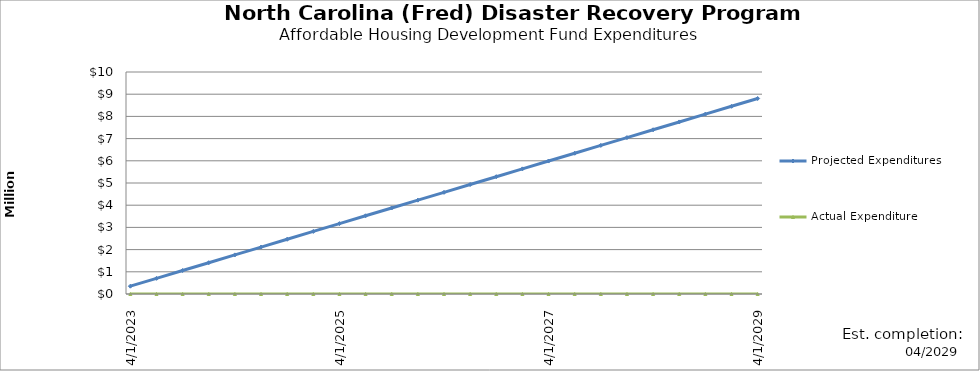
| Category | Projected Expenditures | Actual Expenditure |
|---|---|---|
| 4/1/23 | 352268 | 0 |
| 7/1/23 | 704536 | 0 |
| 10/1/23 | 1056804 | 0 |
| 1/1/24 | 1409072 | 0 |
| 4/1/24 | 1761340 | 0 |
| 7/1/24 | 2113608 | 0 |
| 10/1/24 | 2465876 | 0 |
| 1/1/25 | 2818144 | 0 |
| 4/1/25 | 3170412 | 0 |
| 7/1/25 | 3522680 | 0 |
| 10/1/25 | 3874948 | 0 |
| 1/1/26 | 4227216 | 0 |
| 4/1/26 | 4579484 | 0 |
| 7/1/26 | 4931752 | 0 |
| 10/1/26 | 5284020 | 0 |
| 1/1/27 | 5636288 | 0 |
| 4/1/27 | 5988556 | 0 |
| 7/1/27 | 6340824 | 0 |
| 10/1/27 | 6693092 | 0 |
| 1/1/28 | 7045360 | 0 |
| 4/1/28 | 7397628 | 0 |
| 7/1/28 | 7749896 | 0 |
| 10/1/28 | 8102164 | 0 |
| 1/1/29 | 8454432 | 0 |
| 4/1/29 | 8806700 | 0 |